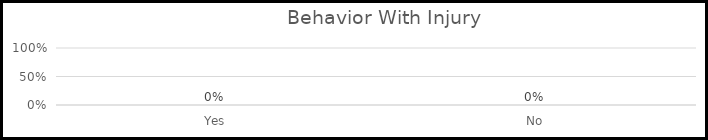
| Category | Behavior With Injury |
|---|---|
| Yes | 0 |
| No | 0 |